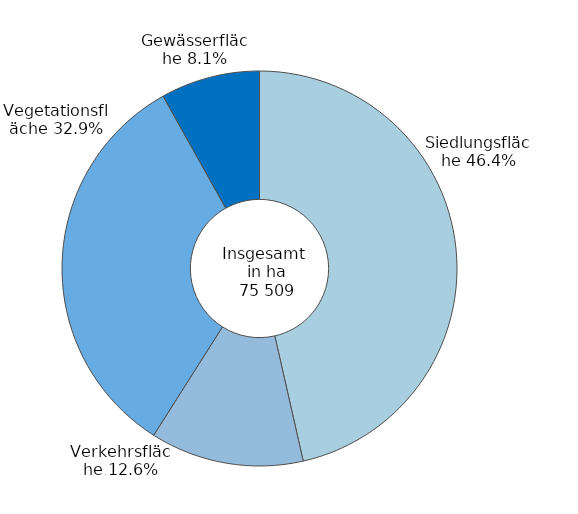
| Category | Series 0 |
|---|---|
| Siedlungsfläche | 0.464 |
| Verkehrsfläche | 0.126 |
| Vegetationsfläche | 0.329 |
| Gewässerfläche | 0.081 |